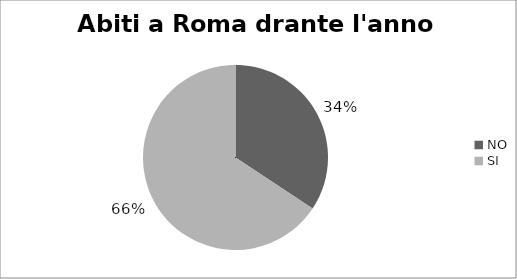
| Category | Totale |
|---|---|
| NO | 35 |
| SI | 67 |